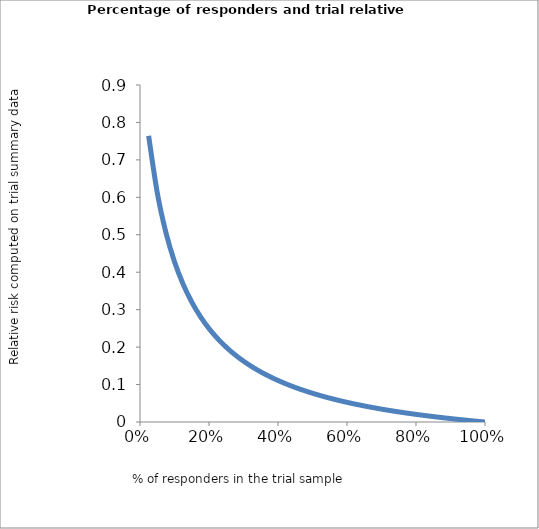
| Category | RR |
|---|---|
| 1.0 | 0 |
| 0.975 | 0.002 |
| 0.95 | 0.004 |
| 0.9249999999999999 | 0.007 |
| 0.8999999999999999 | 0.009 |
| 0.8749999999999999 | 0.012 |
| 0.8499999999999999 | 0.014 |
| 0.8249999999999998 | 0.017 |
| 0.7999999999999998 | 0.02 |
| 0.7749999999999998 | 0.024 |
| 0.7499999999999998 | 0.027 |
| 0.7249999999999998 | 0.031 |
| 0.6999999999999997 | 0.034 |
| 0.6749999999999997 | 0.038 |
| 0.6499999999999997 | 0.043 |
| 0.6249999999999997 | 0.048 |
| 0.5999999999999996 | 0.053 |
| 0.5749999999999996 | 0.058 |
| 0.5499999999999996 | 0.064 |
| 0.5249999999999996 | 0.07 |
| 0.49999999999999956 | 0.077 |
| 0.47499999999999953 | 0.084 |
| 0.4499999999999995 | 0.092 |
| 0.4249999999999995 | 0.101 |
| 0.39999999999999947 | 0.111 |
| 0.37499999999999944 | 0.122 |
| 0.3499999999999994 | 0.134 |
| 0.3249999999999994 | 0.147 |
| 0.2999999999999994 | 0.162 |
| 0.27499999999999936 | 0.18 |
| 0.24999999999999936 | 0.2 |
| 0.22499999999999937 | 0.223 |
| 0.19999999999999937 | 0.25 |
| 0.17499999999999938 | 0.282 |
| 0.14999999999999938 | 0.32 |
| 0.12499999999999939 | 0.368 |
| 0.0999999999999994 | 0.428 |
| 0.0749999999999994 | 0.506 |
| 0.0499999999999994 | 0.612 |
| 0.024999999999999398 | 0.764 |